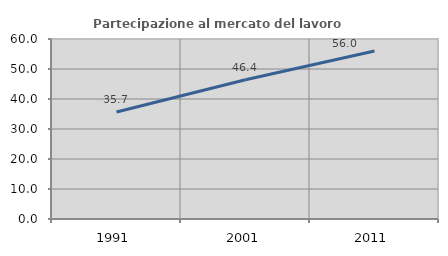
| Category | Partecipazione al mercato del lavoro  femminile |
|---|---|
| 1991.0 | 35.674 |
| 2001.0 | 46.392 |
| 2011.0 | 56.009 |